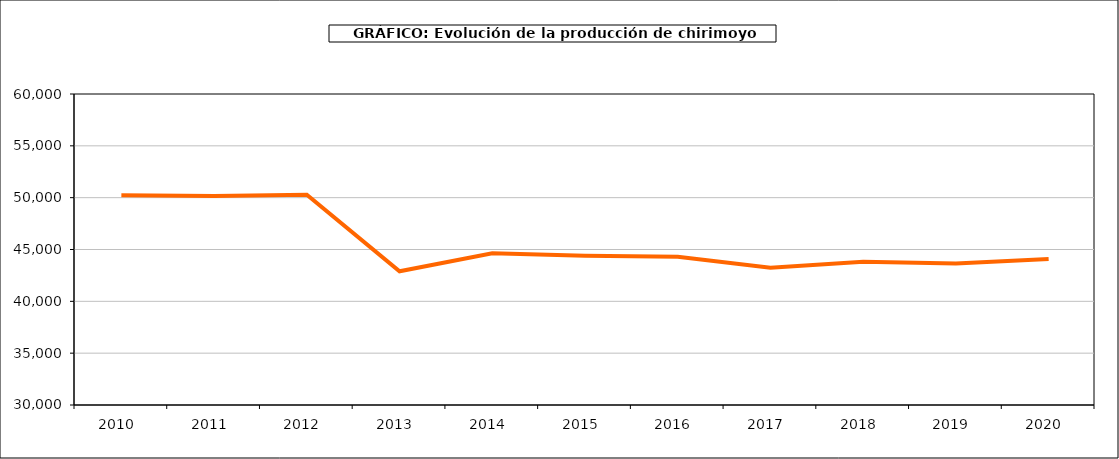
| Category | producción chirimoyo |
|---|---|
| 2010.0 | 50241 |
| 2011.0 | 50150 |
| 2012.0 | 50285 |
| 2013.0 | 42898 |
| 2014.0 | 44629 |
| 2015.0 | 44389 |
| 2016.0 | 44305 |
| 2017.0 | 43251 |
| 2018.0 | 43823 |
| 2019.0 | 43645 |
| 2020.0 | 44081 |